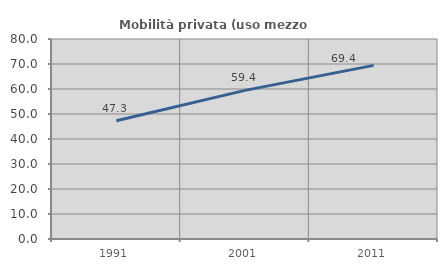
| Category | Mobilità privata (uso mezzo privato) |
|---|---|
| 1991.0 | 47.326 |
| 2001.0 | 59.44 |
| 2011.0 | 69.44 |